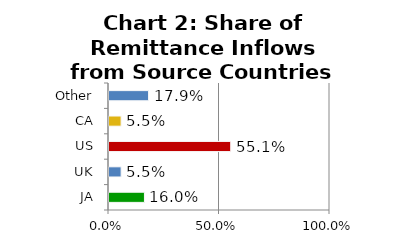
| Category | Chart 2: Share of Remittance Inflows from Source Countries 2022Q4 |
|---|---|
| JA | 0.16 |
| UK | 0.055 |
| US | 0.551 |
| CA | 0.055 |
| Other | 0.179 |